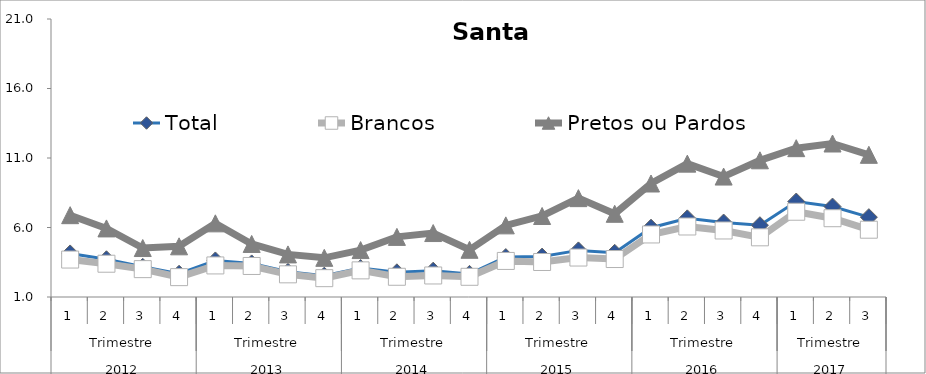
| Category | Total | Brancos | Pretos ou Pardos |
|---|---|---|---|
| 0 | 4.133 | 3.694 | 6.887 |
| 1 | 3.714 | 3.394 | 5.934 |
| 2 | 3.17 | 3.004 | 4.522 |
| 3 | 2.673 | 2.429 | 4.646 |
| 4 | 3.63 | 3.271 | 6.299 |
| 5 | 3.416 | 3.232 | 4.815 |
| 6 | 2.811 | 2.631 | 4.064 |
| 7 | 2.535 | 2.355 | 3.818 |
| 8 | 3.084 | 2.916 | 4.377 |
| 9 | 2.777 | 2.456 | 5.325 |
| 10 | 2.894 | 2.549 | 5.601 |
| 11 | 2.663 | 2.453 | 4.396 |
| 12 | 3.873 | 3.595 | 6.153 |
| 13 | 3.907 | 3.518 | 6.828 |
| 14 | 4.353 | 3.839 | 8.112 |
| 15 | 4.18 | 3.732 | 6.985 |
| 16 | 5.986 | 5.499 | 9.165 |
| 17 | 6.659 | 6.072 | 10.595 |
| 18 | 6.356 | 5.785 | 9.664 |
| 19 | 6.164 | 5.293 | 10.834 |
| 20 | 7.869 | 7.133 | 11.708 |
| 21 | 7.506 | 6.668 | 12.043 |
| 22 | 6.744 | 5.841 | 11.229 |